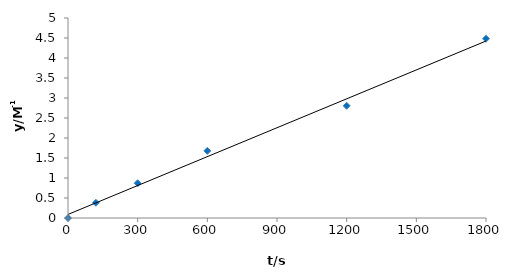
| Category | Series 0 |
|---|---|
| 0.0 | 0 |
| 120.0 | 0.381 |
| 300.0 | 0.869 |
| 600.0 | 1.678 |
| 1200.0 | 2.805 |
| 1800.0 | 4.483 |